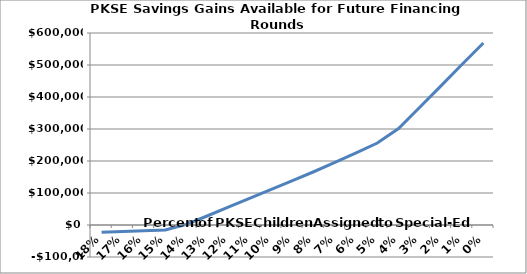
| Category | Present value of PKSE savings gains available to school district |
|---|---|
| 0.18000000000000083 | -22425.129 |
| 0.17000000000000087 | -20130.881 |
| 0.16000000000000092 | -17836.634 |
| 0.15000000000000097 | -15530.87 |
| 0.14000000000000104 | 2012.492 |
| 0.1300000000000011 | 28940.031 |
| 0.12000000000000113 | 56408.561 |
| 0.11000000000000118 | 83987.236 |
| 0.10000000000000123 | 111266.294 |
| 0.0900000000000013 | 138984.007 |
| 0.08000000000000135 | 166396.988 |
| 0.0700000000000014 | 195523.515 |
| 0.06000000000000144 | 225064.616 |
| 0.05000000000000149 | 256273.478 |
| 0.040000000000001534 | 301550.167 |
| 0.03000000000000158 | 368108.015 |
| 0.020000000000001628 | 434665.863 |
| 0.010000000000001674 | 502332.147 |
| 1.7208456881689926e-15 | 568955.197 |